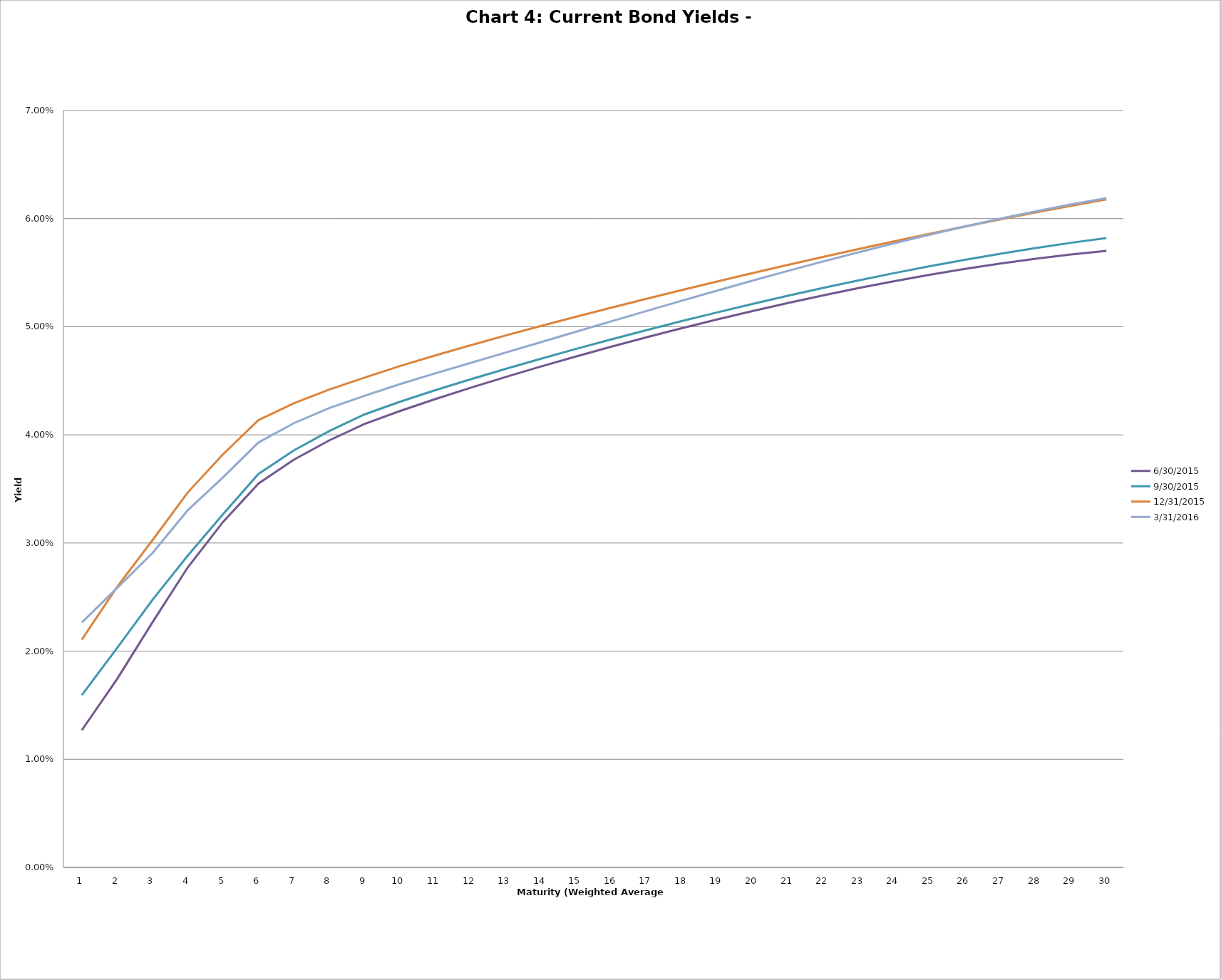
| Category | 6/30/2015 | 9/30/2015 | 12/31/2015 | 3/31/2016 |
|---|---|---|---|---|
| 0 | 0.013 | 0.016 | 0.021 | 0.023 |
| 1 | 0.017 | 0.02 | 0.026 | 0.026 |
| 2 | 0.023 | 0.025 | 0.03 | 0.029 |
| 3 | 0.028 | 0.029 | 0.035 | 0.033 |
| 4 | 0.032 | 0.033 | 0.038 | 0.036 |
| 5 | 0.035 | 0.036 | 0.041 | 0.039 |
| 6 | 0.038 | 0.039 | 0.043 | 0.041 |
| 7 | 0.039 | 0.04 | 0.044 | 0.042 |
| 8 | 0.041 | 0.042 | 0.045 | 0.044 |
| 9 | 0.042 | 0.043 | 0.046 | 0.045 |
| 10 | 0.043 | 0.044 | 0.047 | 0.046 |
| 11 | 0.044 | 0.045 | 0.048 | 0.047 |
| 12 | 0.045 | 0.046 | 0.049 | 0.048 |
| 13 | 0.046 | 0.047 | 0.05 | 0.049 |
| 14 | 0.047 | 0.048 | 0.051 | 0.05 |
| 15 | 0.048 | 0.049 | 0.052 | 0.051 |
| 16 | 0.049 | 0.05 | 0.053 | 0.051 |
| 17 | 0.05 | 0.051 | 0.053 | 0.052 |
| 18 | 0.051 | 0.051 | 0.054 | 0.053 |
| 19 | 0.051 | 0.052 | 0.055 | 0.054 |
| 20 | 0.052 | 0.053 | 0.056 | 0.055 |
| 21 | 0.053 | 0.054 | 0.056 | 0.056 |
| 22 | 0.054 | 0.054 | 0.057 | 0.057 |
| 23 | 0.054 | 0.055 | 0.058 | 0.058 |
| 24 | 0.055 | 0.056 | 0.059 | 0.059 |
| 25 | 0.055 | 0.056 | 0.059 | 0.059 |
| 26 | 0.056 | 0.057 | 0.06 | 0.06 |
| 27 | 0.056 | 0.057 | 0.061 | 0.061 |
| 28 | 0.057 | 0.058 | 0.061 | 0.061 |
| 29 | 0.057 | 0.058 | 0.062 | 0.062 |